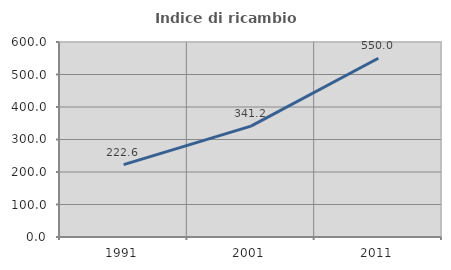
| Category | Indice di ricambio occupazionale  |
|---|---|
| 1991.0 | 222.581 |
| 2001.0 | 341.176 |
| 2011.0 | 550 |